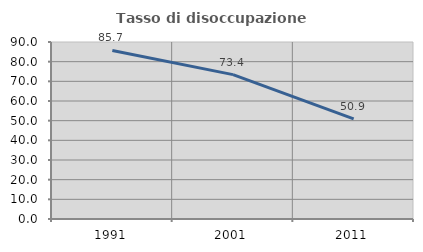
| Category | Tasso di disoccupazione giovanile  |
|---|---|
| 1991.0 | 85.681 |
| 2001.0 | 73.413 |
| 2011.0 | 50.914 |